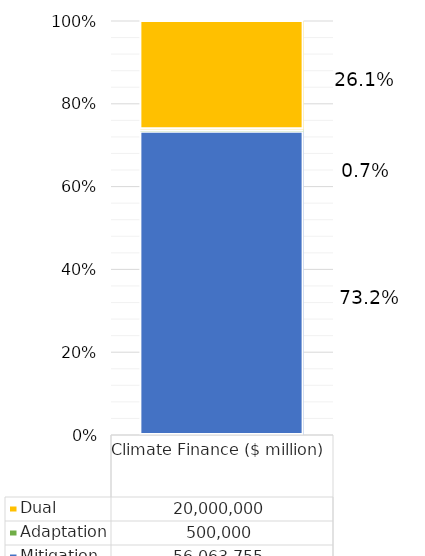
| Category | Mitigation | Adaptation | Dual  |
|---|---|---|---|
| 0 | 56063755 | 500000 | 20000000 |